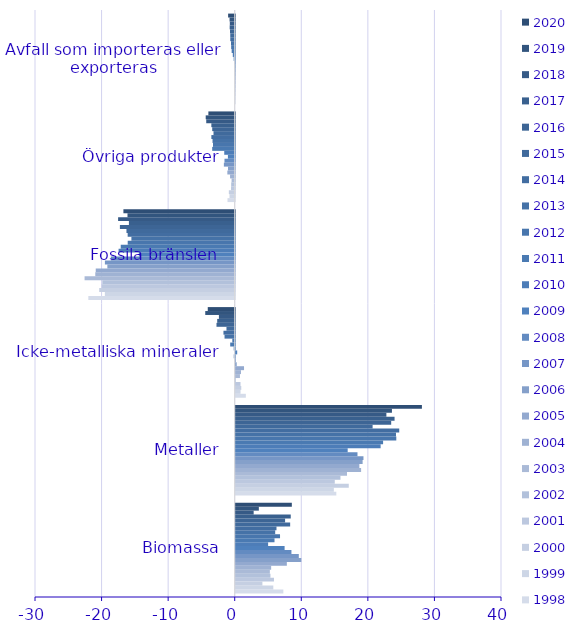
| Category | 1998 | 1999 | 2000 | 2001 | 2002 | 2003 | 2004 | 2005 | 2006 | 2007 | 2008 | 2009 | 2010 | 2011 | 2012 | 2013 | 2014 | 2015 | 2016 | 2017 | 2018 | 2019 | 2020 |
|---|---|---|---|---|---|---|---|---|---|---|---|---|---|---|---|---|---|---|---|---|---|---|---|
| Biomassa | 7.155 | 5.646 | 4.006 | 5.745 | 5.214 | 5.129 | 5.324 | 7.68 | 9.854 | 9.479 | 8.37 | 7.344 | 4.868 | 5.828 | 6.657 | 5.93 | 6.124 | 8.178 | 7.418 | 8.266 | 2.696 | 3.474 | 8.429 |
| Metaller | 15.11 | 14.74 | 16.983 | 14.88 | 15.735 | 16.716 | 18.835 | 18.572 | 19.062 | 19.19 | 18.291 | 16.819 | 21.769 | 22.139 | 24.122 | 24.076 | 24.563 | 20.564 | 23.355 | 23.862 | 22.633 | 23.466 | 27.969 |
| Icke-metalliska mineraler | 1.521 | 0.726 | 0.835 | 0.719 | -0.034 | 0.636 | 0.795 | 1.249 | 0.15 | 0.005 | -0.148 | 0.223 | -0.152 | -0.679 | -0.36 | -1.529 | -1.692 | -1.239 | -2.738 | -2.63 | -2.375 | -4.426 | -4.05 |
| Fossila bränslen | -21.988 | -19.506 | -20.354 | -19.978 | -19.893 | -22.552 | -20.945 | -20.876 | -19.131 | -19.5 | -18.604 | -14.398 | -17.446 | -17.122 | -16.073 | -15.52 | -16.08 | -16.262 | -17.248 | -15.893 | -17.516 | -16.108 | -16.719 |
| Övriga produkter | -1.083 | -0.784 | -0.882 | -0.553 | -0.531 | -0.472 | -0.702 | -1.108 | -1.006 | -1.629 | -1.537 | -1.024 | -1.573 | -3.384 | -3.263 | -3.334 | -3.507 | -3.187 | -3.379 | -3.511 | -4.279 | -4.357 | -3.956 |
| Avfall som importeras eller exporteras | 0 | 0 | 0 | 0 | -0.002 | -0.002 | -0.002 | -0.017 | -0.008 | -0.013 | -0.027 | -0.156 | -0.29 | -0.46 | -0.534 | -0.56 | -0.667 | -0.671 | -0.712 | -0.756 | -0.736 | -0.773 | -0.991 |